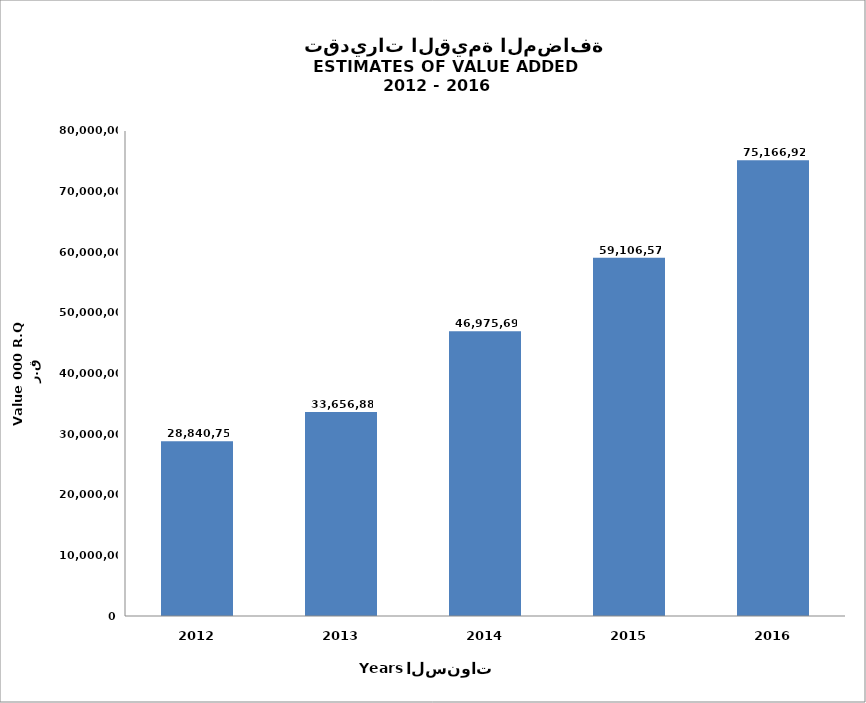
| Category | السنة
Year |
|---|---|
| 2016.0 | 75166929 |
| 2015.0 | 59106571 |
| 2014.0 | 46975693 |
| 2013.0 | 33656880 |
| 2012.0 | 28840751 |